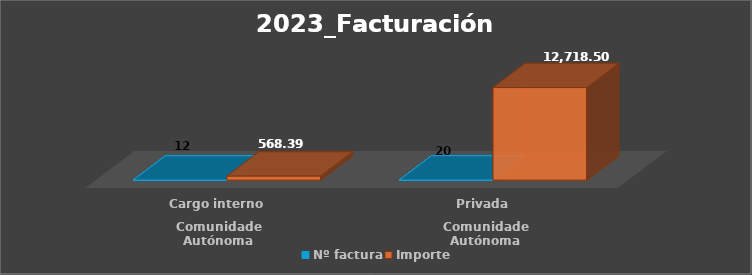
| Category | Nº factura | Importe |
|---|---|---|
| 0 | 12 | 568.39 |
| 1 | 20 | 12718.5 |